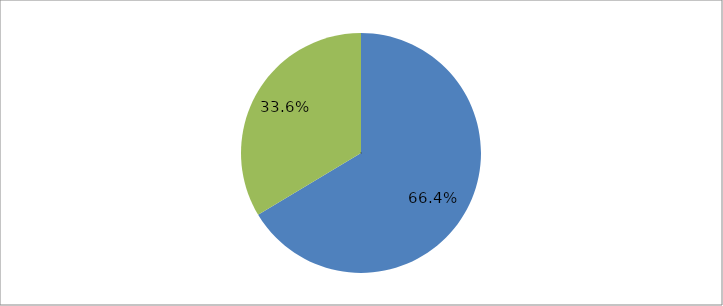
| Category | Series 0 |
|---|---|
| 0 | 0.664 |
| 1 | 0.336 |